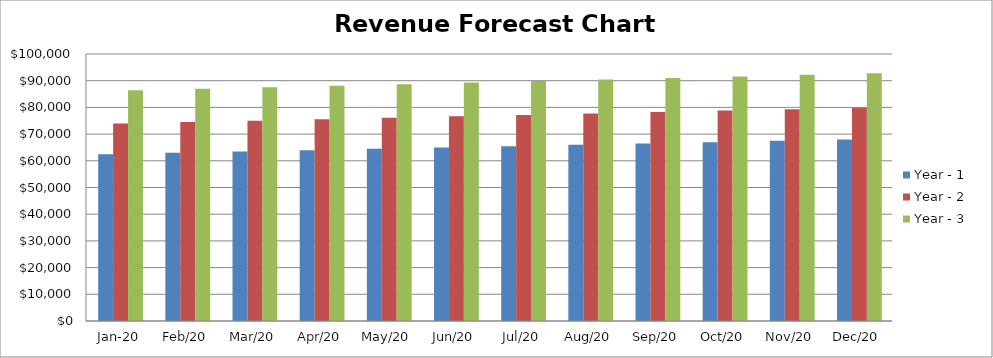
| Category | Year - 1 | Year - 2 | Year - 3 |
|---|---|---|---|
| 2020-01-01 | 62475 | 73952.6 | 86390.2 |
| 2020-02-01 | 62974.8 | 74492.4 | 86970 |
| 2020-03-01 | 63474.6 | 75032.2 | 87549.8 |
| 2020-04-01 | 63974.4 | 75572 | 88129.6 |
| 2020-05-01 | 64474.2 | 76111.8 | 88709.4 |
| 2020-06-01 | 64974 | 76651.6 | 89289.2 |
| 2020-07-01 | 65473.8 | 77191.4 | 89869 |
| 2020-08-01 | 65973.6 | 77731.2 | 90448.8 |
| 2020-09-01 | 66473.4 | 78271 | 91028.6 |
| 2020-10-01 | 66973.2 | 78810.8 | 91608.4 |
| 2020-11-01 | 67473 | 79350.6 | 92188.2 |
| 2020-12-01 | 67972.8 | 79890.4 | 92768 |